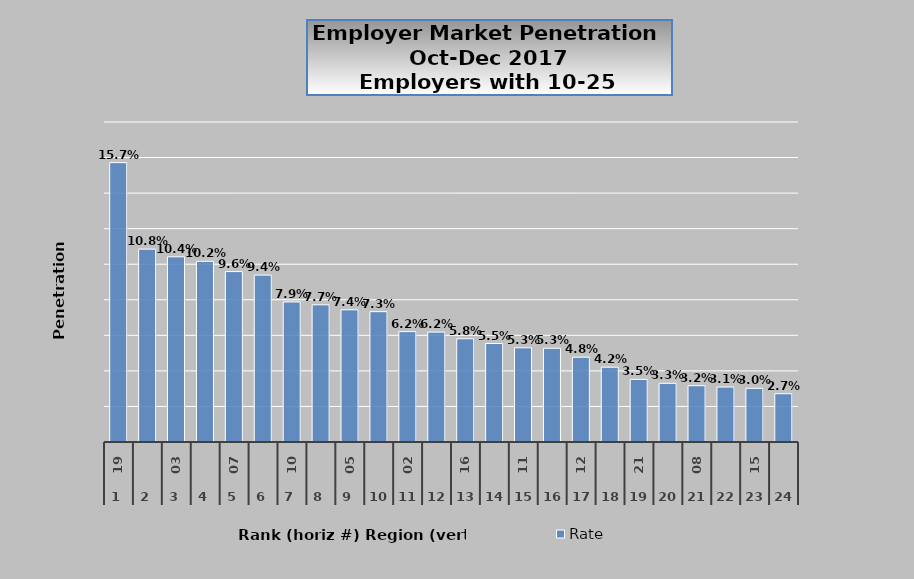
| Category | Rate |
|---|---|
| 0 | 0.157 |
| 1 | 0.108 |
| 2 | 0.104 |
| 3 | 0.102 |
| 4 | 0.096 |
| 5 | 0.094 |
| 6 | 0.079 |
| 7 | 0.077 |
| 8 | 0.074 |
| 9 | 0.073 |
| 10 | 0.062 |
| 11 | 0.062 |
| 12 | 0.058 |
| 13 | 0.055 |
| 14 | 0.053 |
| 15 | 0.053 |
| 16 | 0.048 |
| 17 | 0.042 |
| 18 | 0.035 |
| 19 | 0.033 |
| 20 | 0.032 |
| 21 | 0.031 |
| 22 | 0.03 |
| 23 | 0.027 |